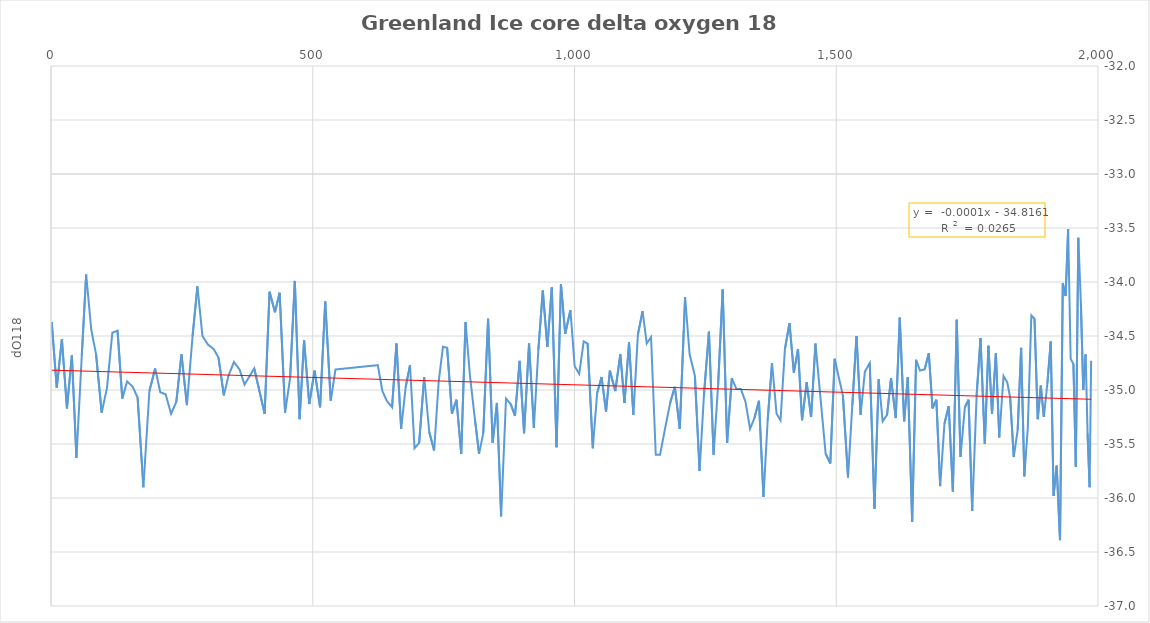
| Category | Series 0 |
|---|---|
| 1986.88 | -34.73 |
| 1983.99 | -35.9 |
| 1980.08 | -35.4 |
| 1976.37 | -34.67 |
| 1971.83 | -35 |
| 1967.33 | -34.2 |
| 1962.41 | -33.59 |
| 1957.62 | -35.71 |
| 1953.06 | -34.76 |
| 1947.75 | -34.71 |
| 1942.95 | -33.51 |
| 1938.21 | -34.13 |
| 1932.76 | -34.01 |
| 1927.46 | -36.39 |
| 1921.03 | -35.7 |
| 1915.12 | -35.98 |
| 1909.73 | -34.55 |
| 1903.32 | -34.94 |
| 1896.56 | -35.25 |
| 1890.69 | -34.96 |
| 1884.9 | -35.27 |
| 1878.68 | -34.34 |
| 1872.68 | -34.31 |
| 1865.9 | -35.35 |
| 1859.36 | -35.8 |
| 1853.17 | -34.61 |
| 1846.59 | -35.37 |
| 1839.08 | -35.62 |
| 1832.17 | -35.07 |
| 1826.73 | -34.93 |
| 1819.55 | -34.87 |
| 1811.43 | -35.44 |
| 1804.94 | -34.66 |
| 1797.57 | -35.22 |
| 1790.65 | -34.59 |
| 1783.79 | -35.5 |
| 1775.57 | -34.52 |
| 1768.16 | -35.05 |
| 1759.77 | -36.12 |
| 1752.74 | -35.09 |
| 1745.72 | -35.16 |
| 1737.3 | -35.62 |
| 1730.16 | -34.35 |
| 1722.77 | -35.94 |
| 1714.84 | -35.15 |
| 1706.74 | -35.31 |
| 1698.52 | -35.89 |
| 1691.22 | -35.09 |
| 1683.91 | -35.17 |
| 1676.8 | -34.66 |
| 1668.67 | -34.81 |
| 1660.0 | -34.82 |
| 1652.5 | -34.72 |
| 1645.0 | -36.22 |
| 1636.67 | -34.88 |
| 1629.67 | -35.29 |
| 1621.33 | -34.33 |
| 1613.67 | -35.26 |
| 1604.67 | -34.89 |
| 1597.0 | -35.23 |
| 1588.67 | -35.29 |
| 1581.0 | -34.9 |
| 1573.0 | -36.1 |
| 1564.0 | -34.75 |
| 1554.67 | -34.83 |
| 1546.5 | -35.23 |
| 1538.67 | -34.5 |
| 1530.67 | -35.14 |
| 1522.5 | -35.81 |
| 1512.67 | -35.05 |
| 1504.67 | -34.88 |
| 1497.0 | -34.71 |
| 1488.67 | -35.68 |
| 1479.75 | -35.59 |
| 1470.0 | -35.08 |
| 1460.33 | -34.57 |
| 1452.0 | -35.25 |
| 1443.5 | -34.93 |
| 1434.67 | -35.28 |
| 1427.0 | -34.62 |
| 1419.0 | -34.84 |
| 1410.67 | -34.38 |
| 1402.0 | -34.62 |
| 1393.5 | -35.28 |
| 1386.0 | -35.22 |
| 1377.33 | -34.75 |
| 1369.0 | -35.28 |
| 1361.0 | -35.99 |
| 1352.33 | -35.1 |
| 1343.67 | -35.26 |
| 1335.33 | -35.36 |
| 1326.67 | -35.11 |
| 1317.67 | -34.99 |
| 1309.33 | -34.99 |
| 1300.5 | -34.89 |
| 1291.5 | -35.49 |
| 1283.08 | -34.07 |
| 1274.37 | -34.95 |
| 1265.67 | -35.6 |
| 1256.8200000000002 | -34.46 |
| 1247.26 | -35.05 |
| 1238.9 | -35.75 |
| 1230.0 | -34.87 |
| 1219.8899999999999 | -34.67 |
| 1211.27 | -34.14 |
| 1201.1100000000001 | -35.36 |
| 1191.65 | -34.97 |
| 1182.7 | -35.12 |
| 1173.29 | -35.35 |
| 1163.45 | -35.6 |
| 1155.22 | -35.6 |
| 1146.22 | -34.51 |
| 1137.96 | -34.57 |
| 1130.04 | -34.27 |
| 1121.0 | -34.49 |
| 1112.47 | -35.23 |
| 1104.15 | -34.56 |
| 1095.5 | -35.12 |
| 1087.52 | -34.67 |
| 1077.9 | -35.01 |
| 1067.5700000000002 | -34.82 |
| 1060.27 | -35.2 |
| 1051.69 | -34.88 |
| 1043.21 | -35.03 |
| 1034.96 | -35.54 |
| 1025.05 | -34.57 |
| 1017.62 | -34.55 |
| 1008.96 | -34.85 |
| 1000.33 | -34.78 |
| 992.22 | -34.26 |
| 982.26 | -34.48 |
| 974.11 | -34.02 |
| 965.67 | -35.53 |
| 956.67 | -34.05 |
| 948.12 | -34.6 |
| 939.45 | -34.08 |
| 930.93 | -34.63 |
| 922.3900000000001 | -35.35 |
| 913.1600000000001 | -34.57 |
| 903.6800000000001 | -35.4 |
| 895.1700000000001 | -34.73 |
| 886.3299999999999 | -35.24 |
| 878.1500000000001 | -35.13 |
| 869.1500000000001 | -35.08 |
| 859.8699999999999 | -36.17 |
| 851.8199999999999 | -35.12 |
| 843.6400000000001 | -35.49 |
| 834.94 | -34.34 |
| 825.73 | -35.4 |
| 817.6800000000001 | -35.59 |
| 809.71 | -35.27 |
| 800.1500000000001 | -34.86 |
| 791.8199999999999 | -34.37 |
| 783.6199999999999 | -35.59 |
| 774.53 | -35.09 |
| 765.9100000000001 | -35.22 |
| 756.7 | -34.61 |
| 748.6800000000001 | -34.6 |
| 740.4300000000001 | -34.93 |
| 731.8800000000001 | -35.56 |
| 722.5899999999999 | -35.39 |
| 712.9000000000001 | -34.88 |
| 703.24 | -35.49 |
| 694.4300000000001 | -35.54 |
| 685.8299999999999 | -34.77 |
| 677.5999999999999 | -34.97 |
| 668.8900000000001 | -35.36 |
| 659.8499999999999 | -34.57 |
| 651.54 | -35.16 |
| 641.4300000000001 | -35.1 |
| 633.0 | -35.01 |
| 624.21 | -34.77 |
| 543.46 | -34.81 |
| 534.3199999999999 | -35.1 |
| 523.8499999999999 | -34.18 |
| 514.04 | -35.16 |
| 503.45000000000005 | -34.82 |
| 493.3699999999999 | -35.13 |
| 483.4100000000001 | -34.54 |
| 474.9200000000001 | -35.27 |
| 465.77 | -33.99 |
| 456.70000000000005 | -34.89 |
| 447.20000000000005 | -35.21 |
| 436.73 | -34.1 |
| 427.80999999999995 | -34.28 |
| 417.44000000000005 | -34.09 |
| 408.0999999999999 | -35.22 |
| 388.22 | -34.8 |
| 369.6199999999999 | -34.95 |
| 360.21000000000004 | -34.81 |
| 349.5 | -34.74 |
| 338.9100000000001 | -34.87 |
| 330.18000000000006 | -35.05 |
| 319.95000000000005 | -34.7 |
| 310.56999999999994 | -34.62 |
| 299.73 | -34.58 |
| 289.29999999999995 | -34.5 |
| 279.71000000000004 | -34.04 |
| 270.45000000000005 | -34.5 |
| 259.6400000000001 | -35.14 |
| 249.21000000000004 | -34.67 |
| 239.3699999999999 | -35.11 |
| 229.3599999999999 | -35.22 |
| 218.95000000000005 | -35.04 |
| 208.74 | -35.02 |
| 199.0 | -34.8 |
| 187.95000000000005 | -35.01 |
| 176.5 | -35.9 |
| 165.41000000000008 | -35.07 |
| 156.1099999999999 | -34.97 |
| 145.44000000000005 | -34.92 |
| 136.17000000000007 | -35.08 |
| 127.1099999999999 | -34.45 |
| 117.17000000000007 | -34.47 |
| 106.94000000000005 | -34.98 |
| 96.79999999999995 | -35.21 |
| 86.08999999999992 | -34.67 |
| 76.8900000000001 | -34.44 |
| 67.17000000000007 | -33.93 |
| 58.819999999999936 | -34.68 |
| 48.58999999999992 | -35.63 |
| 39.90000000000009 | -34.68 |
| 30.470000000000027 | -35.17 |
| 20.799999999999955 | -34.53 |
| 11.0 | -34.98 |
| 1.349999999999909 | -34.37 |